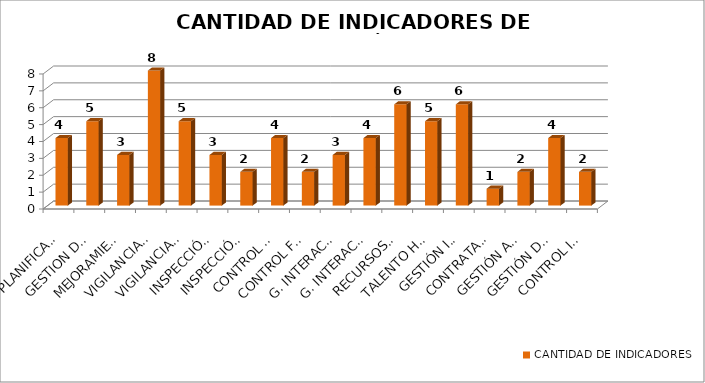
| Category | CANTIDAD DE INDICADORES |
|---|---|
| PLANIFICACIÓN | 4 |
| GESTION DE COMUNICACIONES | 5 |
| MEJORAMIENTO CONTINUO | 3 |
| VIGILANCIA ASOCIATIVA | 8 |
| VIGILANCIA FINANCIERA | 5 |
| INSPECCIÓN ASOCIATIVA | 3 |
| INSPECCIÓN FINANCIERA | 2 |
| CONTROL ASOCIATIVA | 4 |
| CONTROL FINANCIERA | 2 |
| G. INTERACCION CIUDADANA ASOCIATIVA | 3 |
| G. INTERACCION CIUDADANA FINANCIERA | 4 |
| RECURSOS FINANCIEROS | 6 |
| TALENTO HUMANO | 5 |
| GESTIÓN INFRAESTRUCTURA | 6 |
| CONTRATACIÓN | 1 |
| GESTIÓN ASESORÍA JURÍDICA | 2 |
| GESTIÓN DOCUMENTAL | 4 |
| CONTROL INTERNO | 2 |